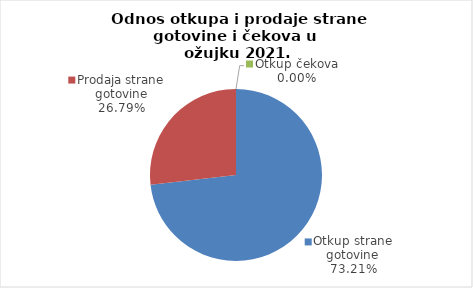
| Category | Series 0 |
|---|---|
| Otkup strane gotovine | 73.205 |
| Prodaja strane gotovine | 26.795 |
| Otkup čekova | 0 |